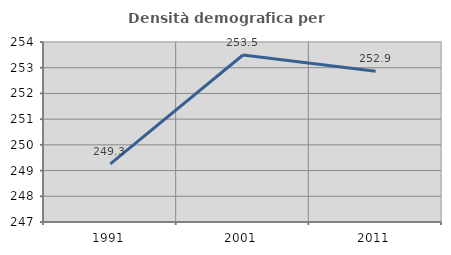
| Category | Densità demografica |
|---|---|
| 1991.0 | 249.259 |
| 2001.0 | 253.494 |
| 2011.0 | 252.859 |